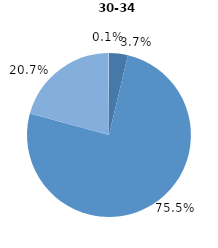
| Category | Series 0 |
|---|---|
| 0 | 3.7 |
| 1 | 75.5 |
| 2 | 20.7 |
| 3 | 0.1 |